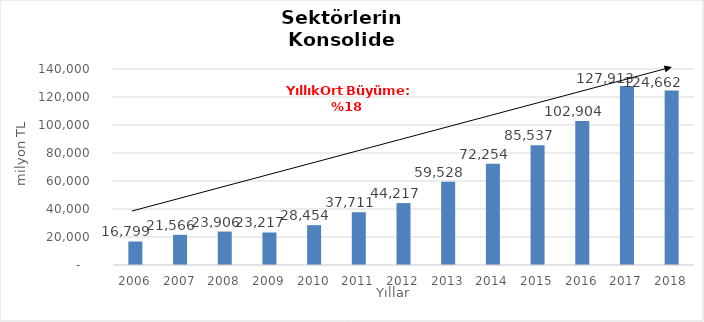
| Category | Toplam |
|---|---|
| 2006.0 | 16799.249 |
| 2007.0 | 21566.057 |
| 2008.0 | 23906.328 |
| 2009.0 | 23216.54 |
| 2010.0 | 28454.489 |
| 2011.0 | 37710.665 |
| 2012.0 | 44216.529 |
| 2013.0 | 59528.288 |
| 2014.0 | 72253.719 |
| 2015.0 | 85537 |
| 2016.0 | 102904 |
| 2017.0 | 127913 |
| 2018.0 | 124662 |